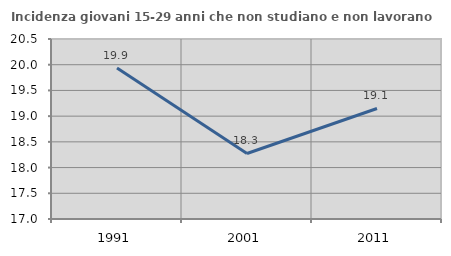
| Category | Incidenza giovani 15-29 anni che non studiano e non lavorano  |
|---|---|
| 1991.0 | 19.938 |
| 2001.0 | 18.274 |
| 2011.0 | 19.149 |